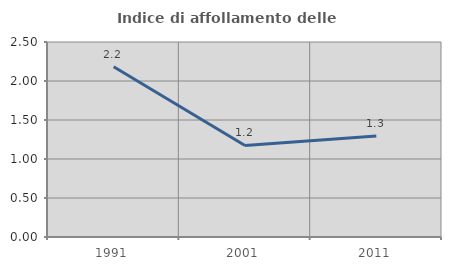
| Category | Indice di affollamento delle abitazioni  |
|---|---|
| 1991.0 | 2.182 |
| 2001.0 | 1.173 |
| 2011.0 | 1.294 |